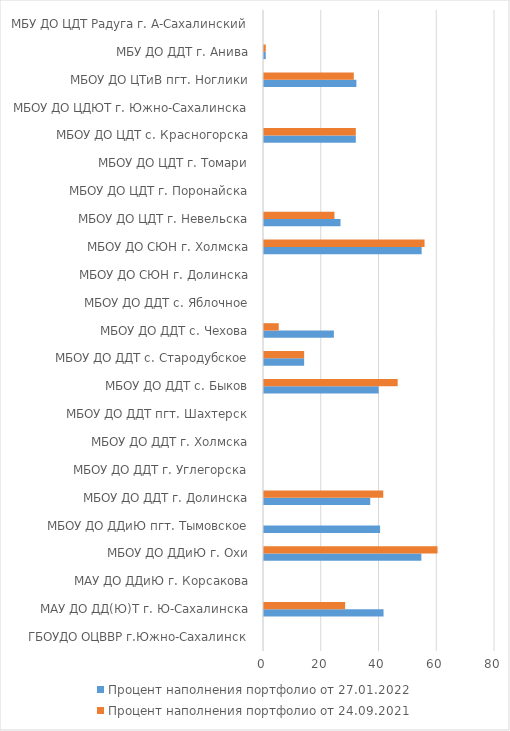
| Category | Процент наполнения портфолио от 27.01.2022 | Процент наполнения портфолио от 24.09.2021 |
|---|---|---|
| ГБОУДО ОЦВВР г.Южно-Сахалинск | 0 | 0 |
| МАУ ДО ДД(Ю)Т г. Ю-Сахалинска | 41.4 | 28.1 |
| МАУ ДО ДДиЮ г. Корсакова | 0 | 0 |
| МБОУ ДО ДДиЮ г. Охи | 54.5 | 60.1 |
| МБОУ ДО ДДиЮ пгт. Тымовское | 40.2 | 0 |
| МБОУ ДО ДДТ г. Долинска | 36.8 | 41.3 |
| МБОУ ДО ДДТ г. Углегорска | 0 | 0 |
| МБОУ ДО ДДТ г. Холмска | 0 | 0 |
| МБОУ ДО ДДТ пгт. Шахтерск | 0 | 0 |
| МБОУ ДО ДДТ с. Быков | 39.7 | 46.3 |
| МБОУ ДО ДДТ с. Стародубское | 13.9 | 13.9 |
| МБОУ ДО ДДТ с. Чехова | 24.2 | 5.1 |
| МБОУ ДО ДДТ с. Яблочное | 0 | 0 |
| МБОУ ДО СЮН г. Долинска | 0 | 0 |
| МБОУ ДО СЮН г. Холмска | 54.6 | 55.6 |
| МБОУ ДО ЦДТ г. Невельска | 26.5 | 24.4 |
| МБОУ ДО ЦДТ г. Поронайска | 0 | 0 |
| МБОУ ДО ЦДТ г. Томари | 0 | 0 |
| МБОУ ДО ЦДТ с. Красногорска | 31.8 | 31.8 |
| МБОУ ДО ЦДЮТ г. Южно-Сахалинска | 0 | 0 |
| МБОУ ДО ЦТиВ пгт. Ноглики | 32 | 31.1 |
| МБУ ДО ДДТ г. Анива | 0.6 | 0.6 |
| МБУ ДО ЦДТ Радуга г. А-Сахалинский | 0 | 0 |